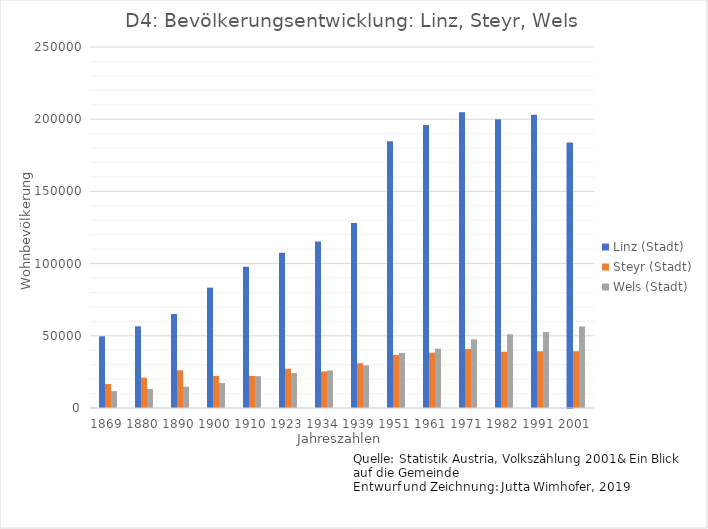
| Category | Linz (Stadt) | Steyr (Stadt) | Wels (Stadt) |
|---|---|---|---|
| 1869.0 | 49635 | 16593 | 11704 |
| 1880.0 | 56569 | 21054 | 13175 |
| 1890.0 | 65090 | 26139 | 14735 |
| 1900.0 | 83356 | 22272 | 17308 |
| 1910.0 | 97852 | 22205 | 22015 |
| 1923.0 | 107463 | 27200 | 24248 |
| 1934.0 | 115338 | 25351 | 25956 |
| 1939.0 | 128177 | 31017 | 29533 |
| 1951.0 | 184685 | 36818 | 38120 |
| 1961.0 | 195978 | 38306 | 41060 |
| 1971.0 | 204889 | 40822 | 47527 |
| 1982.0 | 199910 | 38942 | 51060 |
| 1991.0 | 203044 | 39337 | 52594 |
| 2001.0 | 183504 | 39340 | 56478 |